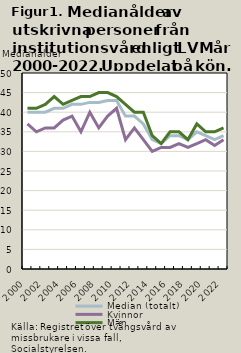
| Category | Median (totalt) | Kvinnor | Män |
|---|---|---|---|
| 2000.0 | 40 | 37 | 41 |
| 2001.0 | 40 | 35 | 41 |
| 2002.0 | 40 | 36 | 42 |
| 2003.0 | 41 | 36 | 44 |
| 2004.0 | 41 | 38 | 42 |
| 2005.0 | 42 | 39 | 43 |
| 2006.0 | 42 | 35 | 44 |
| 2007.0 | 42.5 | 40 | 44 |
| 2008.0 | 42.5 | 36 | 45 |
| 2009.0 | 43 | 39 | 45 |
| 2010.0 | 43 | 41 | 44 |
| 2011.0 | 39 | 33 | 42 |
| 2012.0 | 39 | 36 | 40 |
| 2013.0 | 37 | 33 | 40 |
| 2014.0 | 33 | 30 | 34 |
| 2015.0 | 32 | 31 | 32 |
| 2016.0 | 34 | 31 | 35 |
| 2017.0 | 34 | 32 | 35 |
| 2018.0 | 33 | 31 | 33 |
| 2019.0 | 35 | 32 | 37 |
| 2020.0 | 34 | 33 | 35 |
| 2021.0 | 33 | 31.5 | 35 |
| 2022.0 | 34 | 33 | 36 |